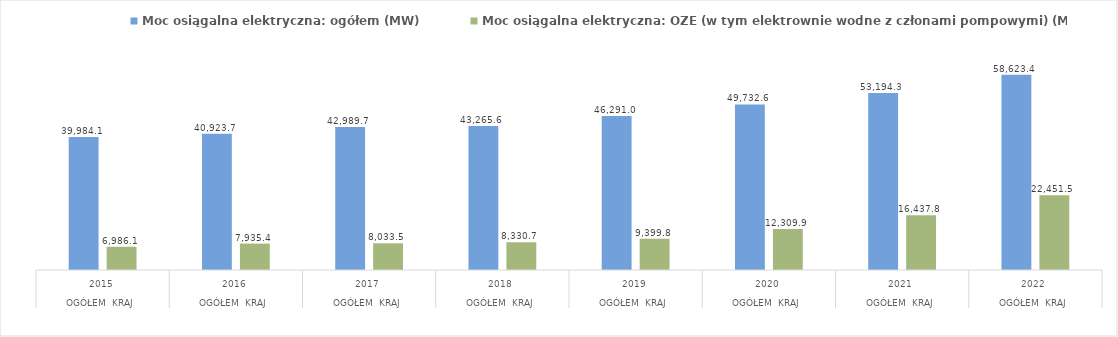
| Category | Moc osiągalna elektryczna: ogółem (MW) | Moc osiągalna elektryczna: OZE (w tym elektrownie wodne z członami pompowymi) (MW) |
|---|---|---|
| 0 | 39984.087 | 6986.06 |
| 1 | 40923.69 | 7935.38 |
| 2 | 42989.708 | 8033.51 |
| 3 | 43265.643 | 8330.7 |
| 4 | 46291.016 | 9399.8 |
| 5 | 49732.63 | 12309.86 |
| 6 | 53194.265 | 16437.849 |
| 7 | 58623.438 | 22451.511 |